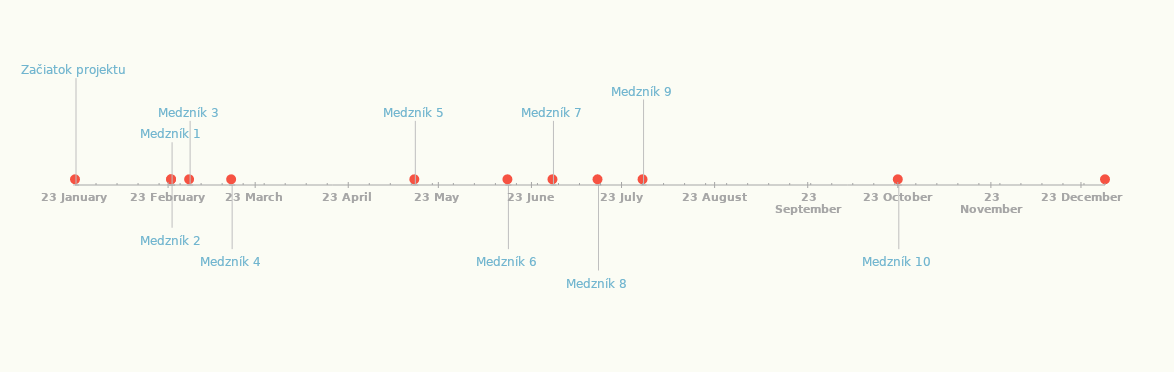
| Category | UMIESTNENIE |
|---|---|
| Začiatok projektu | 25 |
| Medzník 1 | 10 |
| Medzník 2 | -10 |
| Medzník 3 | 15 |
| Medzník 4 | -15 |
| Medzník 5 | 15 |
| Medzník 6 | -15 |
| Medzník 7 | 15 |
| Medzník 8 | -20 |
| Medzník 9 | 20 |
| Medzník 10 | -15 |
| Ukončenie projektu | 15 |